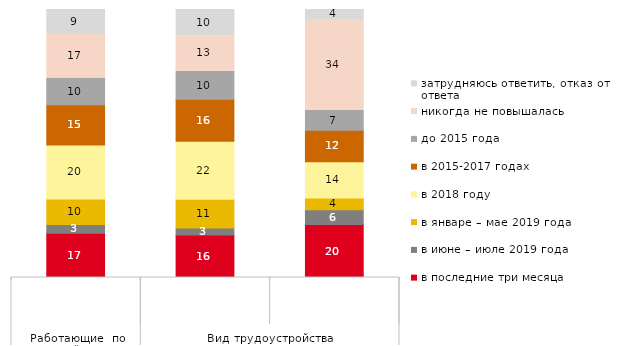
| Category | в последние три месяца | в июне – июле 2019 года | в январе – мае 2019 года | в 2018 году | в 2015-2017 годах | до 2015 года | никогда не повышалась | затрудняюсь ответить, отказ от ответа |
|---|---|---|---|---|---|---|---|---|
| 0 | 16.523 | 3.247 | 9.551 | 20.153 | 14.995 | 9.933 | 16.619 | 8.978 |
| 1 | 15.844 | 2.641 | 10.677 | 21.699 | 15.614 | 10.448 | 13.318 | 9.759 |
| 2 | 19.753 | 5.556 | 4.321 | 13.58 | 11.728 | 7.407 | 33.951 | 3.704 |